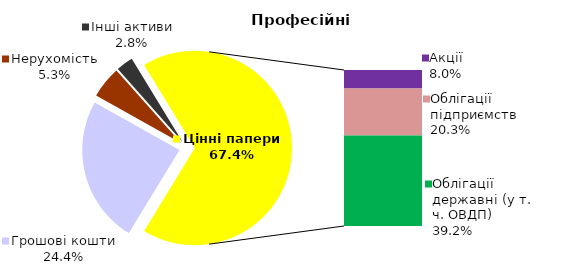
| Category | Професійні |
|---|---|
| Грошові кошти | 32.407 |
| Банківські метали | 0 |
| Нерухомість | 7.062 |
| Інші активи | 3.764 |
| Акції | 10.644 |
| Облігації підприємств | 26.882 |
| Муніципальні облігації | 0 |
| Облігації державні (у т. ч. ОВДП) | 51.972 |